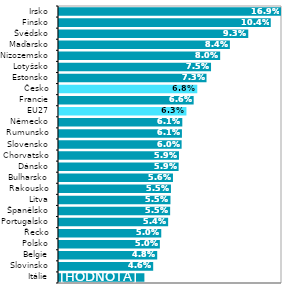
| Category | Series 0 |
|---|---|
| Itálie | 0.042 |
| Slovinsko | 0.046 |
| Belgie | 0.048 |
| Polsko | 0.05 |
| Řecko | 0.05 |
| Portugalsko | 0.054 |
| Španělsko | 0.055 |
| Litva | 0.055 |
| Rakousko | 0.055 |
| Bulharsko | 0.056 |
| Dánsko | 0.059 |
| Chorvatsko | 0.059 |
| Slovensko | 0.06 |
| Rumunsko | 0.061 |
| Německo | 0.061 |
| EU27 | 0.063 |
| Francie | 0.066 |
| Česko | 0.068 |
| Estonsko | 0.073 |
| Lotyšsko | 0.075 |
| Nizozemsko | 0.08 |
| Maďarsko | 0.084 |
| Švédsko | 0.093 |
| Finsko | 0.104 |
| Irsko | 0.169 |